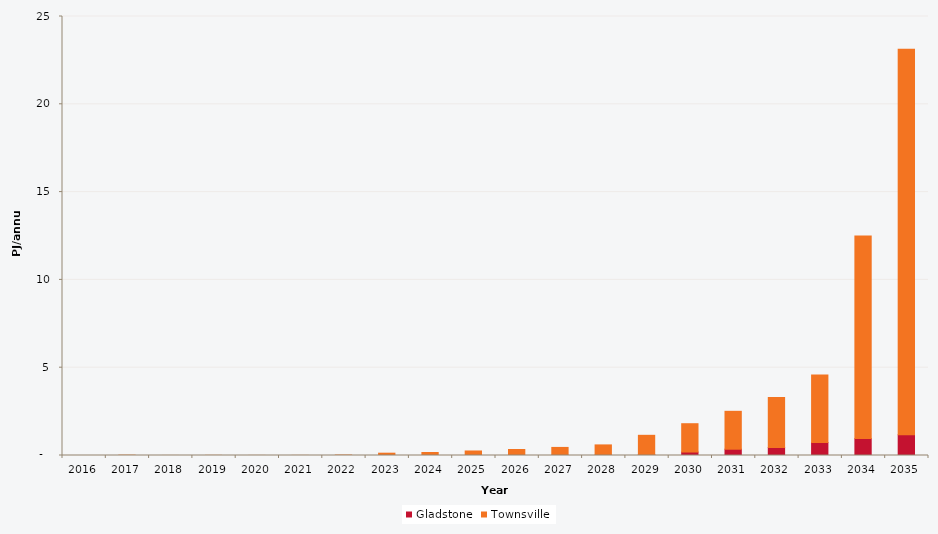
| Category | Gladstone | Townsville |
|---|---|---|
| 2016.0 | 0 | 0 |
| 2017.0 | 0 | 0.018 |
| 2018.0 | 0 | 0.002 |
| 2019.0 | 0 | 0.008 |
| 2020.0 | 0 | 0.004 |
| 2021.0 | 0 | 0.005 |
| 2022.0 | 0 | 0.025 |
| 2023.0 | 0 | 0.132 |
| 2024.0 | 0 | 0.171 |
| 2025.0 | 0 | 0.257 |
| 2026.0 | 0.003 | 0.337 |
| 2027.0 | 0.008 | 0.452 |
| 2028.0 | 0.013 | 0.59 |
| 2029.0 | 0.052 | 1.097 |
| 2030.0 | 0.197 | 1.613 |
| 2031.0 | 0.359 | 2.157 |
| 2032.0 | 0.462 | 2.844 |
| 2033.0 | 0.736 | 3.855 |
| 2034.0 | 0.962 | 11.534 |
| 2035.0 | 1.181 | 21.953 |